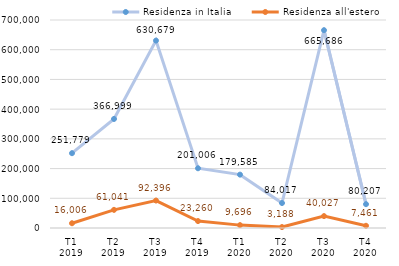
| Category | Residenza in Italia | Residenza all'estero |
|---|---|---|
| T1
2019 | 251779 | 16006 |
| T2
2019 | 366999 | 61041 |
| T3
2019 | 630679 | 92396 |
| T4
2019 | 201006 | 23260 |
| T1
2020 | 179585 | 9696 |
| T2
2020 | 84017 | 3188 |
| T3
2020 | 665686 | 40027 |
| T4
2020 | 80207 | 7461 |